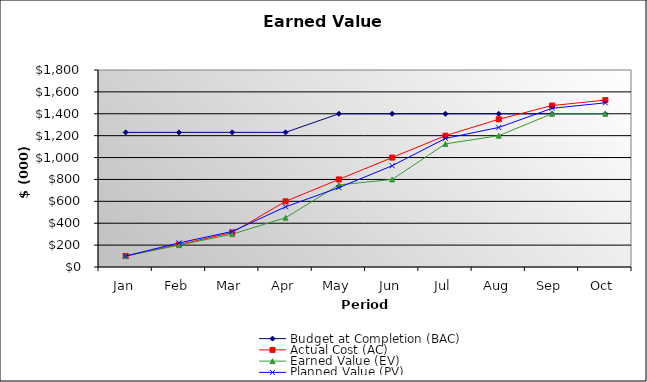
| Category | Budget at Completion (BAC) | Actual Cost (AC) | Earned Value (EV) | Planned Value (PV) |
|---|---|---|---|---|
| Jan | 1230 | 100 | 100 | 100 |
| Feb | 1230 | 205 | 200 | 220 |
| Mar | 1230 | 315 | 300 | 325 |
| Apr | 1230 | 600 | 450 | 550 |
| May | 1400 | 800 | 750 | 725 |
| Jun | 1400 | 1000 | 800 | 925 |
| Jul | 1400 | 1200 | 1125 | 1175 |
| Aug | 1400 | 1350 | 1200 | 1275 |
| Sep | 1400 | 1475 | 1400 | 1450 |
| Oct | 1400 | 1525 | 1400 | 1500 |